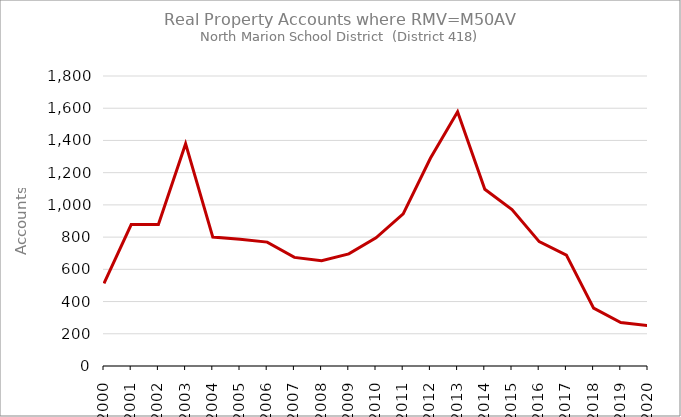
| Category | RMVM50AV |
|---|---|
| 2000.0 | 513 |
| 2001.0 | 878 |
| 2002.0 | 879 |
| 2003.0 | 1380 |
| 2004.0 | 800 |
| 2005.0 | 787 |
| 2006.0 | 769 |
| 2007.0 | 674 |
| 2008.0 | 654 |
| 2009.0 | 696 |
| 2010.0 | 796 |
| 2011.0 | 944 |
| 2012.0 | 1289 |
| 2013.0 | 1578 |
| 2014.0 | 1097 |
| 2015.0 | 971 |
| 2016.0 | 772 |
| 2017.0 | 688 |
| 2018.0 | 359 |
| 2019.0 | 270 |
| 2020.0 | 250 |